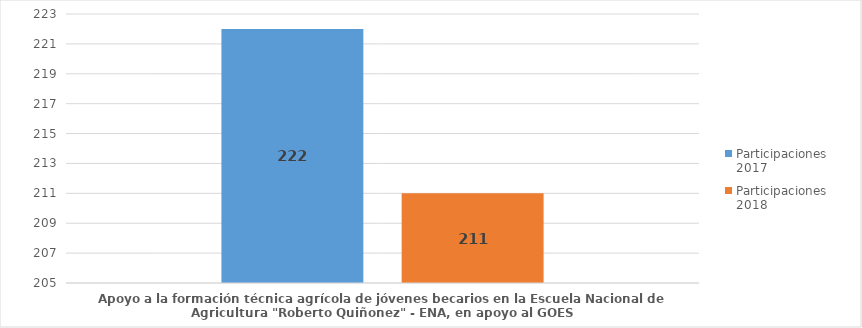
| Category | Participaciones 2017 | Participaciones 
2018 |
|---|---|---|
| Apoyo a la formación técnica agrícola de jóvenes becarios en la Escuela Nacional de Agricultura "Roberto Quiñonez" - ENA, en apoyo al GOES | 222 | 211 |